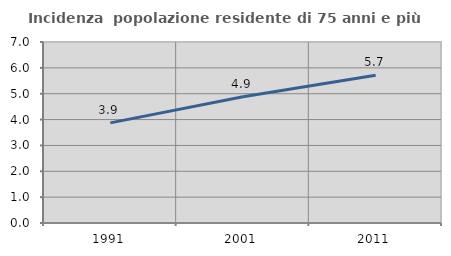
| Category | Incidenza  popolazione residente di 75 anni e più |
|---|---|
| 1991.0 | 3.871 |
| 2001.0 | 4.883 |
| 2011.0 | 5.714 |